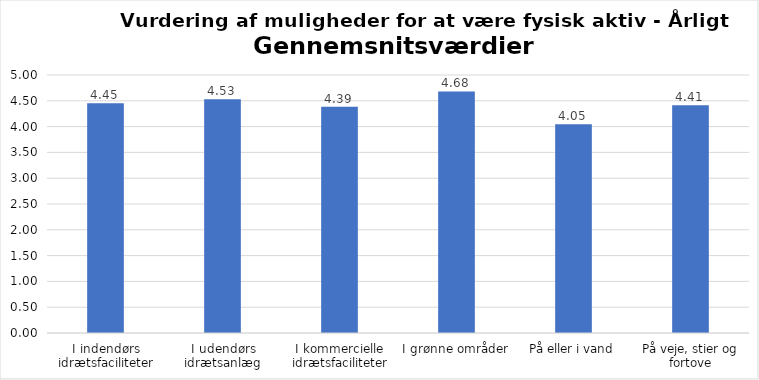
| Category | Gennemsnit |
|---|---|
| I indendørs idrætsfaciliteter | 4.453 |
| I udendørs idrætsanlæg | 4.532 |
| I kommercielle idrætsfaciliteter | 4.385 |
| I grønne områder | 4.681 |
| På eller i vand | 4.046 |
| På veje, stier og fortove | 4.414 |